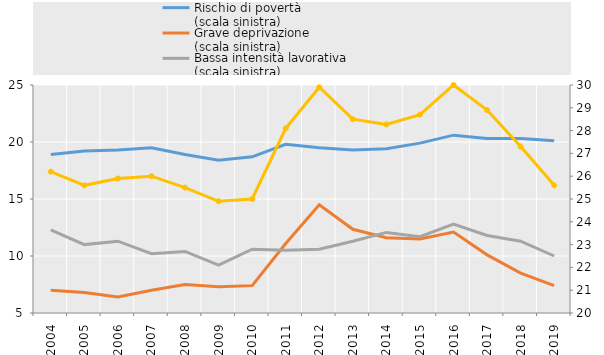
| Category | Rischio di povertà 
(scala sinistra) | Grave deprivazione 
(scala sinistra) | Bassa intensità lavorativa 
(scala sinistra) |
|---|---|---|---|
| 2004.0 | 18.9 | 7 | 12.3 |
| 2005.0 | 19.2 | 6.8 | 11 |
| 2006.0 | 19.3 | 6.4 | 11.3 |
| 2007.0 | 19.5 | 7 | 10.2 |
| 2008.0 | 18.9 | 7.5 | 10.4 |
| 2009.0 | 18.4 | 7.3 | 9.2 |
| 2010.0 | 18.7 | 7.4 | 10.6 |
| 2011.0 | 19.8 | 11.1 | 10.5 |
| 2012.0 | 19.5 | 14.5 | 10.6 |
| 2013.0 | 19.29 | 12.34 | 11.3 |
| 2014.0 | 19.4 | 11.6 | 12.07 |
| 2015.0 | 19.9 | 11.5 | 11.7 |
| 2016.0 | 20.6 | 12.1 | 12.8 |
| 2017.0 | 20.3 | 10.1 | 11.8 |
| 2018.0 | 20.3 | 8.5 | 11.3 |
| 2019.0 | 20.1 | 7.4 | 10 |